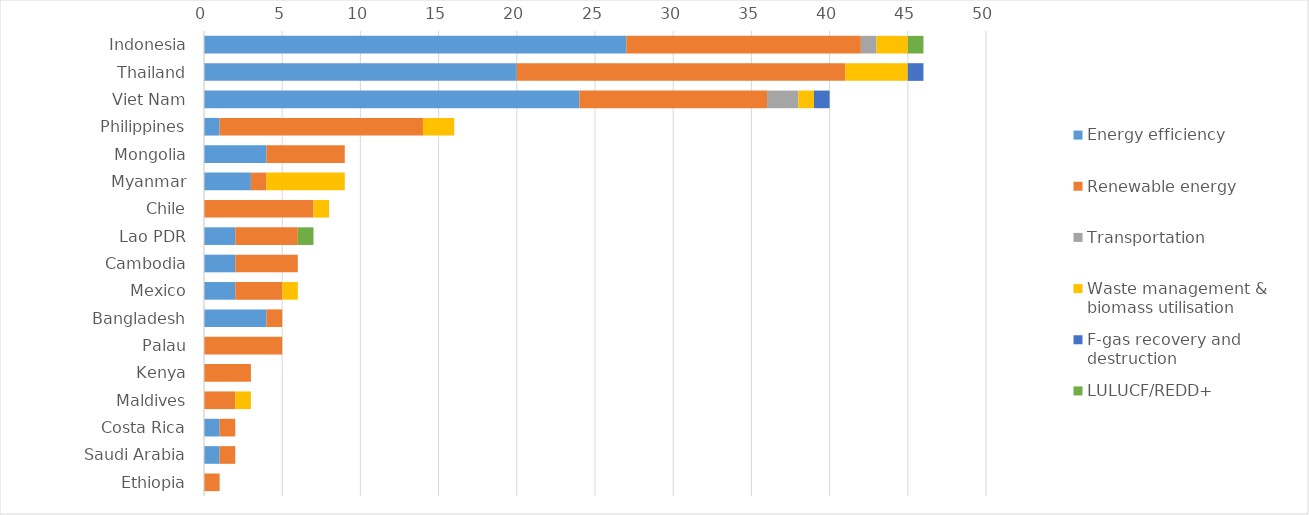
| Category | Energy efficiency | Renewable energy | Transportation | Waste management & biomass utilisation | F-gas recovery and destruction | LULUCF/REDD+ |
|---|---|---|---|---|---|---|
| Indonesia | 27 | 15 | 1 | 2 | 0 | 1 |
| Thailand | 20 | 21 | 0 | 4 | 1 | 0 |
| Viet Nam | 24 | 12 | 2 | 1 | 1 | 0 |
| Philippines | 1 | 13 | 0 | 2 | 0 | 0 |
| Mongolia | 4 | 5 | 0 | 0 | 0 | 0 |
| Myanmar | 3 | 1 | 0 | 5 | 0 | 0 |
| Chile | 0 | 7 | 0 | 1 | 0 | 0 |
| Lao PDR | 2 | 4 | 0 | 0 | 0 | 1 |
| Cambodia | 2 | 4 | 0 | 0 | 0 | 0 |
| Mexico | 2 | 3 | 0 | 1 | 0 | 0 |
| Bangladesh | 4 | 1 | 0 | 0 | 0 | 0 |
| Palau | 0 | 5 | 0 | 0 | 0 | 0 |
| Kenya | 0 | 3 | 0 | 0 | 0 | 0 |
| Maldives | 0 | 2 | 0 | 1 | 0 | 0 |
| Costa Rica | 1 | 1 | 0 | 0 | 0 | 0 |
| Saudi Arabia | 1 | 1 | 0 | 0 | 0 | 0 |
| Ethiopia | 0 | 1 | 0 | 0 | 0 | 0 |